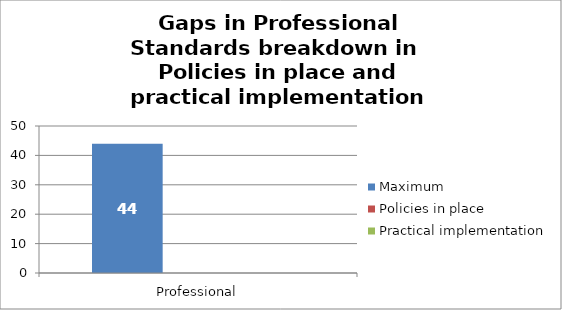
| Category | Maximum | Policies in place | Practical implementation |
|---|---|---|---|
| Professional | 44 | 0 | 0 |